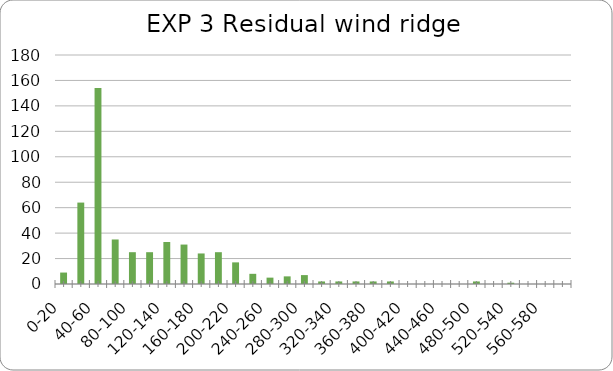
| Category | Series 0 |
|---|---|
| 0-20 | 9 |
| 20-40 | 64 |
| 40-60 | 154 |
| 60-80 | 35 |
| 80-100 | 25 |
| 100-120 | 25 |
| 120-140 | 33 |
| 140-160 | 31 |
| 160-180 | 24 |
| 180-200 | 25 |
| 200-220 | 17 |
| 220-240 | 8 |
| 240-260 | 5 |
| 260-280 | 6 |
| 280-300 | 7 |
| 300-320 | 2 |
| 320-340 | 2 |
| 340-360 | 2 |
| 360-380 | 2 |
| 380-400 | 2 |
| 400-420 | 0 |
| 420-440 | 0 |
| 440-460 | 0 |
| 460-480 | 0 |
| 480-500 | 2 |
| 500-520 | 0 |
| 520-540 | 1 |
| 540-560 | 0 |
| 560-580 | 0 |
| 580-600 | 0 |